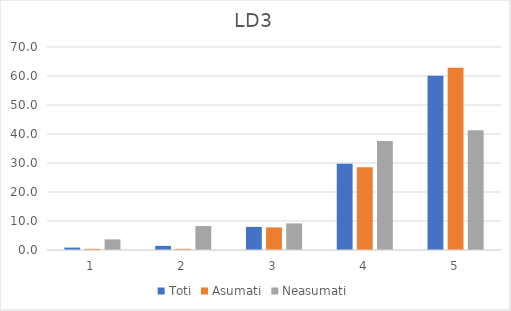
| Category | Toti | Asumati | Neasumati |
|---|---|---|---|
| 0 | 0.832 | 0.41 | 3.67 |
| 1 | 1.427 | 0.41 | 8.257 |
| 2 | 7.967 | 7.787 | 9.174 |
| 3 | 29.727 | 28.552 | 37.615 |
| 4 | 60.048 | 62.842 | 41.284 |